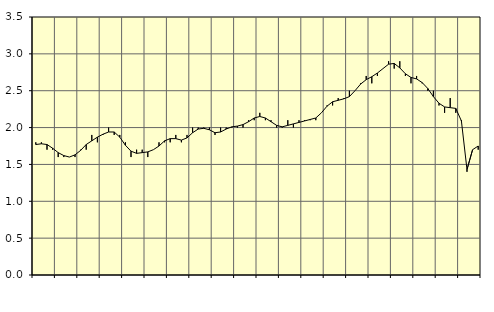
| Category | Piggar | Series 1 |
|---|---|---|
| nan | 1.8 | 1.77 |
| 1.0 | 1.8 | 1.78 |
| 1.0 | 1.7 | 1.77 |
| 1.0 | 1.7 | 1.72 |
| nan | 1.6 | 1.66 |
| 2.0 | 1.6 | 1.62 |
| 2.0 | 1.6 | 1.6 |
| 2.0 | 1.6 | 1.63 |
| nan | 1.7 | 1.69 |
| 3.0 | 1.7 | 1.77 |
| 3.0 | 1.9 | 1.82 |
| 3.0 | 1.8 | 1.87 |
| nan | 1.9 | 1.91 |
| 4.0 | 2 | 1.94 |
| 4.0 | 1.9 | 1.94 |
| 4.0 | 1.9 | 1.87 |
| nan | 1.8 | 1.76 |
| 5.0 | 1.6 | 1.68 |
| 5.0 | 1.7 | 1.65 |
| 5.0 | 1.7 | 1.66 |
| nan | 1.6 | 1.67 |
| 6.0 | 1.7 | 1.7 |
| 6.0 | 1.8 | 1.75 |
| 6.0 | 1.8 | 1.82 |
| nan | 1.8 | 1.85 |
| 7.0 | 1.9 | 1.85 |
| 7.0 | 1.8 | 1.83 |
| 7.0 | 1.9 | 1.86 |
| nan | 2 | 1.93 |
| 8.0 | 2 | 1.98 |
| 8.0 | 2 | 1.99 |
| 8.0 | 2 | 1.97 |
| nan | 1.9 | 1.93 |
| 9.0 | 2 | 1.94 |
| 9.0 | 2 | 1.98 |
| 9.0 | 2 | 2.01 |
| nan | 2 | 2.02 |
| 10.0 | 2 | 2.04 |
| 10.0 | 2.1 | 2.08 |
| 10.0 | 2.1 | 2.13 |
| nan | 2.2 | 2.15 |
| 11.0 | 2.1 | 2.13 |
| 11.0 | 2.1 | 2.08 |
| 11.0 | 2 | 2.03 |
| nan | 2 | 2.01 |
| 12.0 | 2.1 | 2.03 |
| 12.0 | 2 | 2.05 |
| 12.0 | 2.1 | 2.07 |
| nan | 2.1 | 2.09 |
| 13.0 | 2.1 | 2.11 |
| 13.0 | 2.1 | 2.13 |
| 13.0 | 2.2 | 2.2 |
| nan | 2.3 | 2.29 |
| 14.0 | 2.3 | 2.35 |
| 14.0 | 2.4 | 2.37 |
| 14.0 | 2.4 | 2.39 |
| nan | 2.5 | 2.42 |
| 15.0 | 2.5 | 2.5 |
| 15.0 | 2.6 | 2.59 |
| 15.0 | 2.7 | 2.65 |
| nan | 2.6 | 2.69 |
| 16.0 | 2.7 | 2.74 |
| 16.0 | 2.8 | 2.8 |
| 16.0 | 2.9 | 2.86 |
| nan | 2.8 | 2.87 |
| 17.0 | 2.9 | 2.81 |
| 17.0 | 2.7 | 2.73 |
| 17.0 | 2.6 | 2.68 |
| nan | 2.7 | 2.66 |
| 18.0 | 2.6 | 2.61 |
| 18.0 | 2.5 | 2.53 |
| 18.0 | 2.5 | 2.42 |
| nan | 2.3 | 2.33 |
| 19.0 | 2.2 | 2.28 |
| 19.0 | 2.4 | 2.27 |
| 19.0 | 2.2 | 2.26 |
| nan | 2.1 | 2.09 |
| 20.0 | 1.4 | 1.43 |
| 20.0 | 1.7 | 1.7 |
| 20.0 | 1.7 | 1.75 |